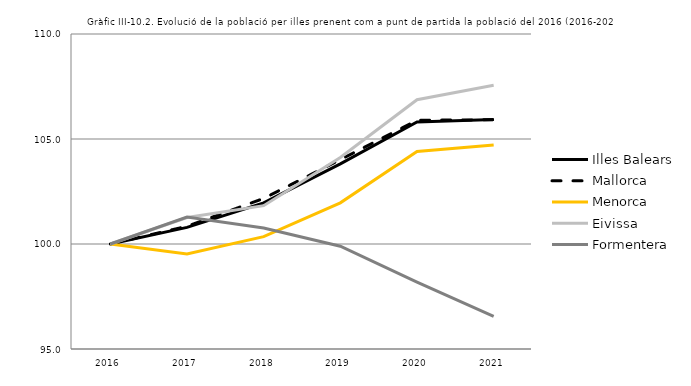
| Category | Illes Balears | Mallorca | Menorca | Eivissa | Formentera |
|---|---|---|---|---|---|
| 2016.0 | 100 | 100 | 100 | 100 | 100 |
| 2017.0 | 100.793 | 100.843 | 99.529 | 101.261 | 101.287 |
| 2018.0 | 101.959 | 102.169 | 100.348 | 101.826 | 100.759 |
| 2019.0 | 103.815 | 104.018 | 101.961 | 104.117 | 99.893 |
| 2020.0 | 105.809 | 105.89 | 104.41 | 106.872 | 98.185 |
| 2021.0 | 105.927 | 105.919 | 104.714 | 107.56 | 96.552 |